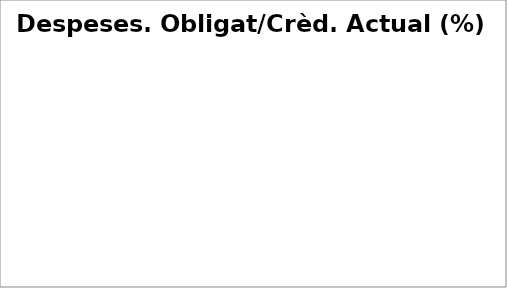
| Category | Series 0 |
|---|---|
| Despeses de personal | 0.583 |
| Despeses en béns corrents i serveis | 0.374 |
| Despeses financeres | 0.487 |
| Transferències corrents | 0.545 |
| Fons de contingència | 0 |
| Inversions reals | 0.32 |
| Transferències de capital | 0.141 |
| Actius financers | 0.493 |
| Passius financers | 0.325 |